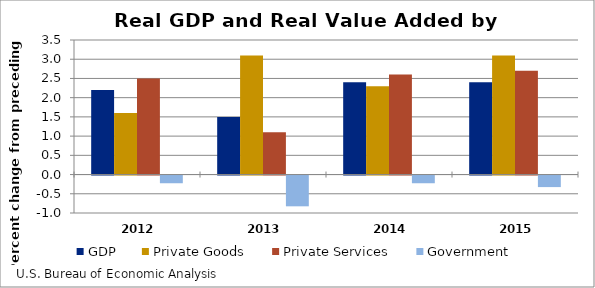
| Category | GDP | Private Goods | Private Services | Government |
|---|---|---|---|---|
| 2012.0 | 2.2 | 1.6 | 2.5 | -0.2 |
| 2013.0 | 1.5 | 3.1 | 1.1 | -0.8 |
| 2014.0 | 2.4 | 2.3 | 2.6 | -0.2 |
| 2015.0 | 2.4 | 3.1 | 2.7 | -0.3 |